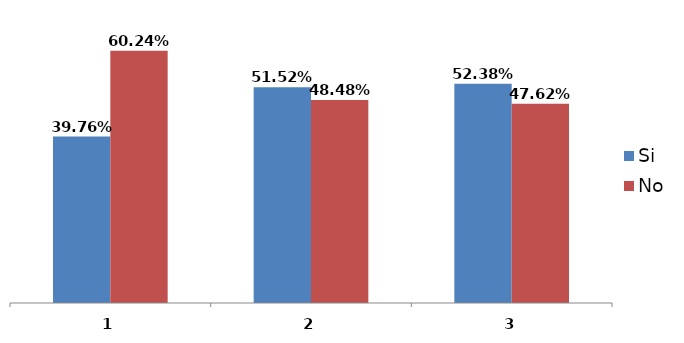
| Category | Si | No |
|---|---|---|
| 0 | 0.398 | 0.602 |
| 1 | 0.515 | 0.485 |
| 2 | 0.524 | 0.476 |